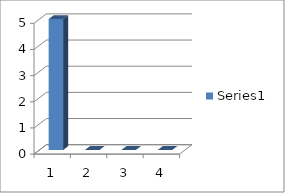
| Category | Series 0 |
|---|---|
| 0 | 5 |
| 1 | 0 |
| 2 | 0 |
| 3 | 0 |